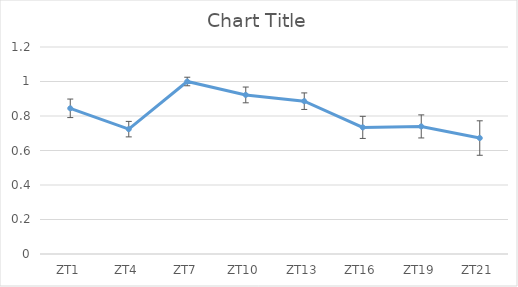
| Category | Series 0 |
|---|---|
| ZT1 | 0.845 |
| ZT4 | 0.724 |
| ZT7 | 1 |
| ZT10 | 0.922 |
| ZT13 | 0.886 |
| ZT16 | 0.734 |
| ZT19 | 0.74 |
| ZT21 | 0.672 |